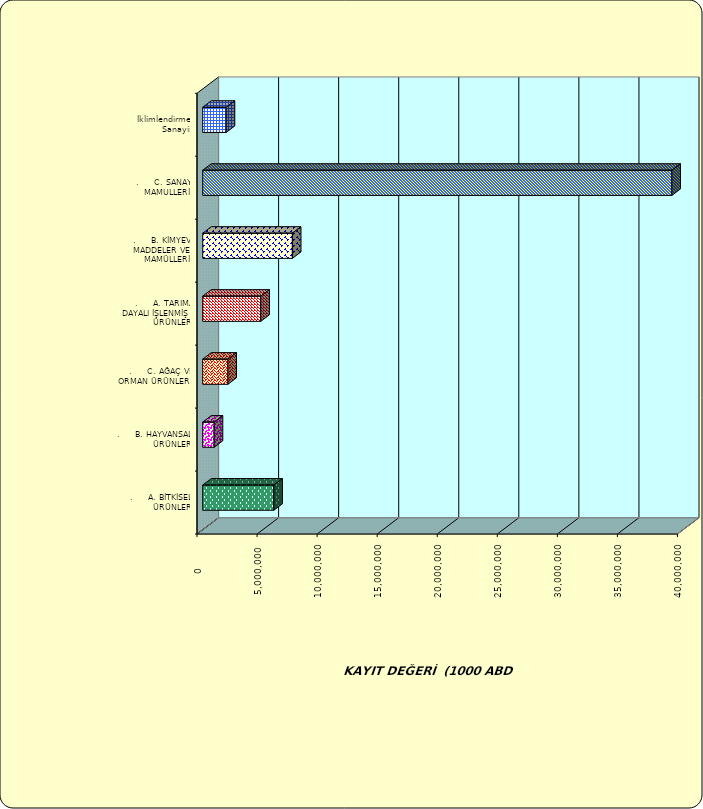
| Category | Series 0 |
|---|---|
| .     A. BİTKİSEL ÜRÜNLER | 5924381.191 |
| .     B. HAYVANSAL ÜRÜNLER | 955429.319 |
| .     C. AĞAÇ VE ORMAN ÜRÜNLERİ | 2098243.828 |
| .     A. TARIMA DAYALI İŞLENMİŞ ÜRÜNLER | 4838416.209 |
| .     B. KİMYEVİ MADDELER VE MAMÜLLERİ | 7466783.542 |
| .     C. SANAYİ MAMULLERİ | 39060446.818 |
|  İklimlendirme Sanayii | 1954303.487 |